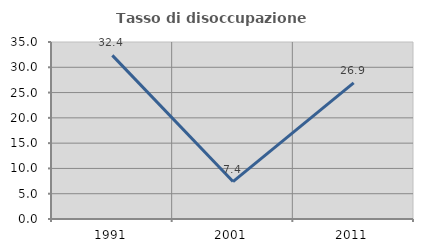
| Category | Tasso di disoccupazione giovanile  |
|---|---|
| 1991.0 | 32.353 |
| 2001.0 | 7.407 |
| 2011.0 | 26.923 |